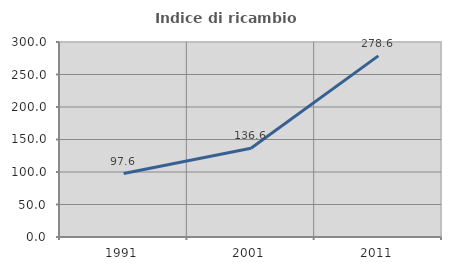
| Category | Indice di ricambio occupazionale  |
|---|---|
| 1991.0 | 97.645 |
| 2001.0 | 136.632 |
| 2011.0 | 278.643 |